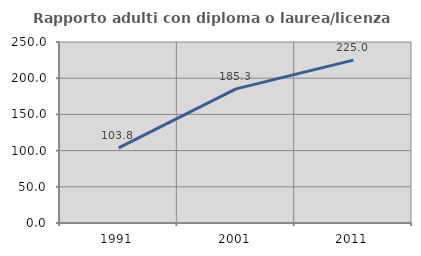
| Category | Rapporto adulti con diploma o laurea/licenza media  |
|---|---|
| 1991.0 | 103.81 |
| 2001.0 | 185.263 |
| 2011.0 | 225 |